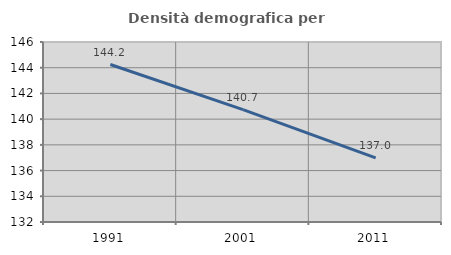
| Category | Densità demografica |
|---|---|
| 1991.0 | 144.249 |
| 2001.0 | 140.741 |
| 2011.0 | 136.986 |